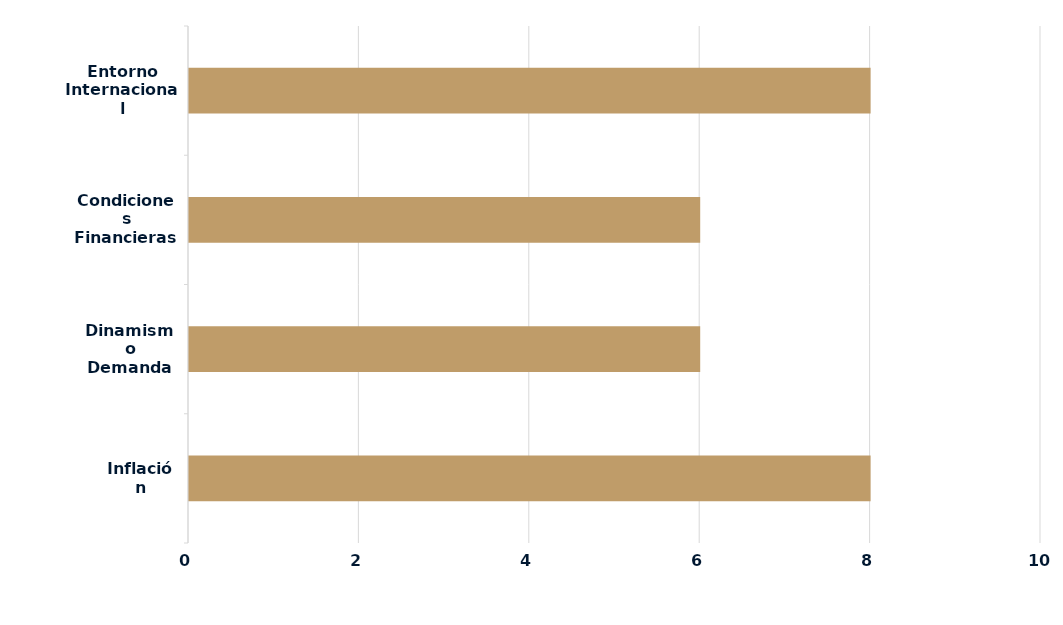
| Category | Series 0 |
|---|---|
| Inflación | 8 |
| Dinamismo Demanda | 6 |
| Condiciones Financieras Locales | 6 |
| Entorno Internacional | 8 |